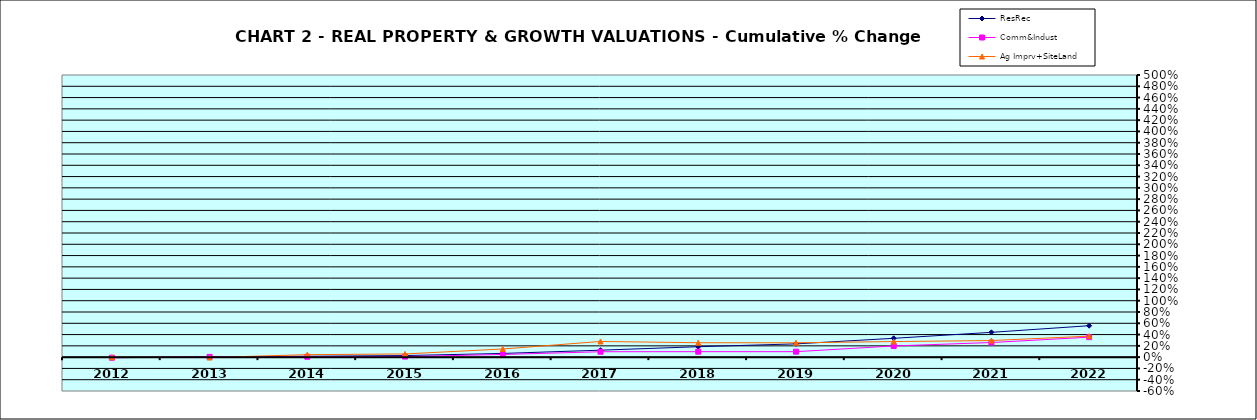
| Category | ResRec | Comm&Indust | Ag Imprv+SiteLand |
|---|---|---|---|
| 2012.0 | -0.009 | -0.01 | 0 |
| 2013.0 | 0.002 | 0.005 | -0.007 |
| 2014.0 | 0.015 | 0.006 | 0.044 |
| 2015.0 | 0.028 | 0.01 | 0.057 |
| 2016.0 | 0.065 | 0.048 | 0.145 |
| 2017.0 | 0.123 | 0.096 | 0.278 |
| 2018.0 | 0.185 | 0.097 | 0.256 |
| 2019.0 | 0.235 | 0.097 | 0.255 |
| 2020.0 | 0.334 | 0.198 | 0.276 |
| 2021.0 | 0.44 | 0.259 | 0.294 |
| 2022.0 | 0.557 | 0.354 | 0.372 |